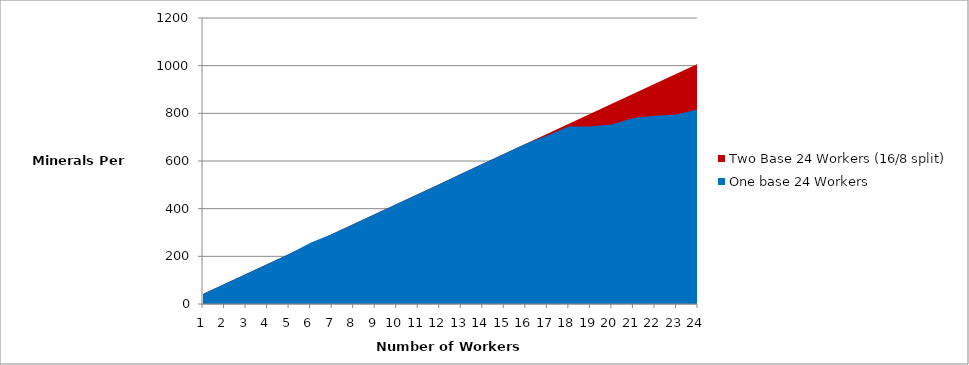
| Category | Two Base 24 Workers (16/8 split) | One base 24 Workers |
|---|---|---|
| 0 | 42 | 42 |
| 1 | 84 | 84 |
| 2 | 126 | 126 |
| 3 | 168 | 168 |
| 4 | 210 | 210 |
| 5 | 252 | 257 |
| 6 | 294 | 294 |
| 7 | 336 | 336 |
| 8 | 378 | 378 |
| 9 | 420 | 420 |
| 10 | 462 | 462 |
| 11 | 504 | 504 |
| 12 | 546 | 546 |
| 13 | 588 | 588 |
| 14 | 630 | 630 |
| 15 | 672 | 672 |
| 16 | 714 | 707.5 |
| 17 | 756 | 745 |
| 18 | 798 | 745 |
| 19 | 840 | 753 |
| 20 | 882 | 780 |
| 21 | 924 | 790 |
| 22 | 966 | 795 |
| 23 | 1008 | 817.5 |